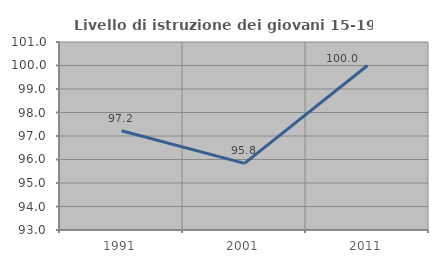
| Category | Livello di istruzione dei giovani 15-19 anni |
|---|---|
| 1991.0 | 97.222 |
| 2001.0 | 95.833 |
| 2011.0 | 100 |